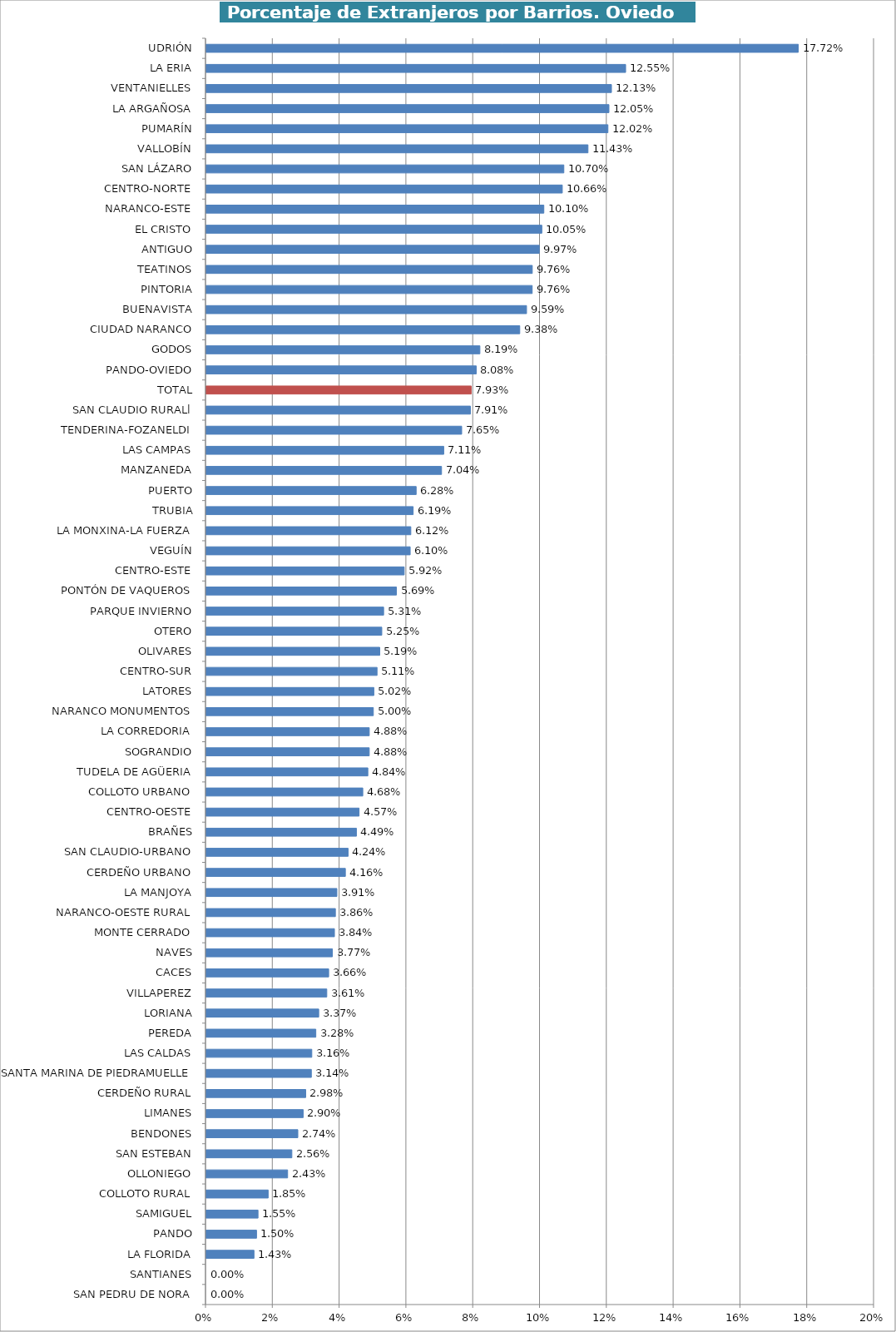
| Category | Series 0 |
|---|---|
| SAN PEDRU DE NORA | 0 |
| SANTIANES | 0 |
| LA FLORIDA | 0.014 |
| PANDO | 0.015 |
| SAMIGUEL | 0.015 |
| COLLOTO RURAL | 0.019 |
| OLLONIEGO | 0.024 |
| SAN ESTEBAN | 0.026 |
| BENDONES | 0.027 |
| LIMANES | 0.029 |
| CERDEÑO RURAL | 0.03 |
| SANTA MARINA DE PIEDRAMUELLE | 0.031 |
| LAS CALDAS | 0.032 |
| PEREDA | 0.033 |
| LORIANA | 0.034 |
| VILLAPEREZ | 0.036 |
| CACES | 0.037 |
| NAVES | 0.038 |
| MONTE CERRADO | 0.038 |
| NARANCO-OESTE RURAL | 0.039 |
| LA MANJOYA | 0.039 |
| CERDEÑO URBANO | 0.042 |
| SAN CLAUDIO-URBANO | 0.042 |
| BRAÑES | 0.045 |
| CENTRO-OESTE | 0.046 |
| COLLOTO URBANO | 0.047 |
| TUDELA DE AGÜERIA | 0.048 |
| SOGRANDIO | 0.049 |
| LA CORREDORIA | 0.049 |
| NARANCO MONUMENTOS | 0.05 |
| LATORES | 0.05 |
| CENTRO-SUR | 0.051 |
| OLIVARES | 0.052 |
| OTERO | 0.053 |
| PARQUE INVIERNO | 0.053 |
| PONTÓN DE VAQUEROS | 0.057 |
| CENTRO-ESTE | 0.059 |
| VEGUÍN | 0.061 |
| LA MONXINA-LA FUERZA | 0.061 |
| TRUBIA | 0.062 |
| PUERTO | 0.063 |
| MANZANEDA | 0.07 |
| LAS CAMPAS | 0.071 |
| TENDERINA-FOZANELDI | 0.076 |
| SAN CLAUDIO RURALl | 0.079 |
| TOTAL | 0.079 |
| PANDO-OVIEDO | 0.081 |
| GODOS | 0.082 |
| CIUDAD NARANCO | 0.094 |
| BUENAVISTA | 0.096 |
| PINTORIA | 0.098 |
| TEATINOS | 0.098 |
| ANTIGUO | 0.1 |
| EL CRISTO | 0.1 |
| NARANCO-ESTE | 0.101 |
| CENTRO-NORTE | 0.107 |
| SAN LÁZARO | 0.107 |
| VALLOBÍN | 0.114 |
| PUMARÍN | 0.12 |
| LA ARGAÑOSA | 0.121 |
| VENTANIELLES | 0.121 |
| LA ERIA | 0.126 |
| UDRIÓN | 0.177 |